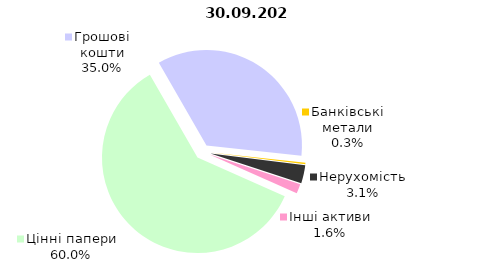
| Category | 30.09.2021 |
|---|---|
| Цінні папери | 2273.735 |
| Грошові кошти | 1326.223 |
| Банківські метали | 10.307 |
| Нерухомість | 116.085 |
| Інші активи | 61.831 |